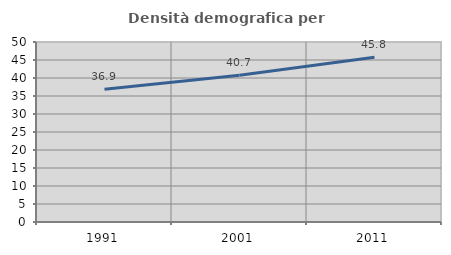
| Category | Densità demografica |
|---|---|
| 1991.0 | 36.902 |
| 2001.0 | 40.736 |
| 2011.0 | 45.756 |